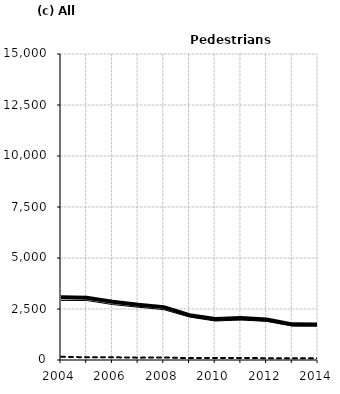
| Category | Built-up | Non built-up | Total |
|---|---|---|---|
| 2004.0 | 2921 | 157 | 3078 |
| 2005.0 | 2918 | 133 | 3051 |
| 2006.0 | 2719 | 134 | 2853 |
| 2007.0 | 2589 | 115 | 2704 |
| 2008.0 | 2469 | 124 | 2593 |
| 2009.0 | 2107 | 92 | 2199 |
| 2010.0 | 1911 | 102 | 2013 |
| 2011.0 | 1961 | 103 | 2064 |
| 2012.0 | 1894 | 87 | 1981 |
| 2013.0 | 1665 | 82 | 1747 |
| 2014.0 | 1661 | 83 | 1744 |